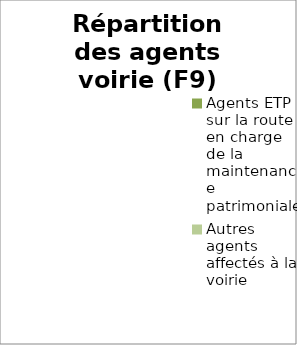
| Category | Series 0 |
|---|---|
| Agents ETP sur la route en charge de la maintenance patrimoniale | 0 |
| Autres agents affectés à la voirie | 0 |